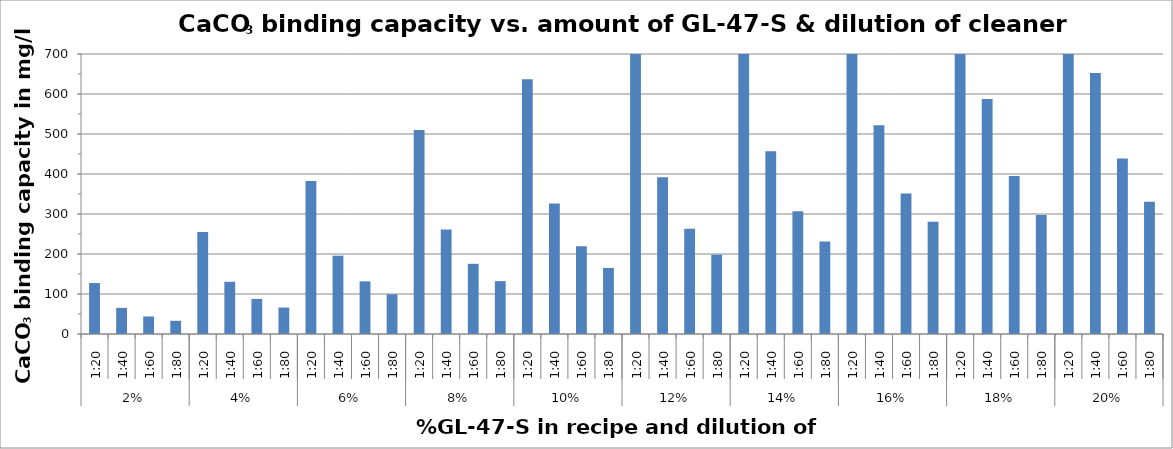
| Category | Series 0 |
|---|---|
| 0 | 127.427 |
| 1 | 65.267 |
| 2 | 43.868 |
| 3 | 33.037 |
| 4 | 254.853 |
| 5 | 130.535 |
| 6 | 87.736 |
| 7 | 66.073 |
| 8 | 382.28 |
| 9 | 195.802 |
| 10 | 131.605 |
| 11 | 99.11 |
| 12 | 509.707 |
| 13 | 261.069 |
| 14 | 175.473 |
| 15 | 132.146 |
| 16 | 637.134 |
| 17 | 326.337 |
| 18 | 219.341 |
| 19 | 165.183 |
| 20 | 764.56 |
| 21 | 391.604 |
| 22 | 263.209 |
| 23 | 198.219 |
| 24 | 891.987 |
| 25 | 456.871 |
| 26 | 307.078 |
| 27 | 231.256 |
| 28 | 1019.414 |
| 29 | 522.139 |
| 30 | 350.946 |
| 31 | 280.811 |
| 32 | 1146.841 |
| 33 | 587.406 |
| 34 | 394.814 |
| 35 | 297.329 |
| 36 | 1274.267 |
| 37 | 652.673 |
| 38 | 438.682 |
| 39 | 330.366 |